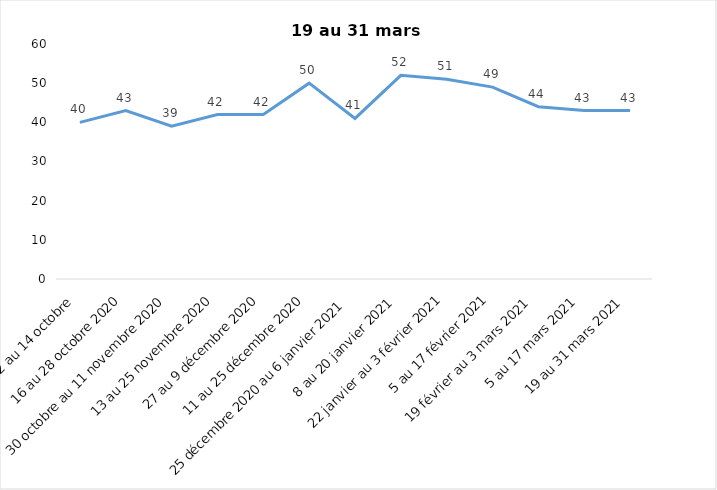
| Category | Toujours aux trois mesures |
|---|---|
| 2 au 14 octobre  | 40 |
| 16 au 28 octobre 2020 | 43 |
| 30 octobre au 11 novembre 2020 | 39 |
| 13 au 25 novembre 2020 | 42 |
| 27 au 9 décembre 2020 | 42 |
| 11 au 25 décembre 2020 | 50 |
| 25 décembre 2020 au 6 janvier 2021 | 41 |
| 8 au 20 janvier 2021 | 52 |
| 22 janvier au 3 février 2021 | 51 |
| 5 au 17 février 2021 | 49 |
| 19 février au 3 mars 2021 | 44 |
| 5 au 17 mars 2021 | 43 |
| 19 au 31 mars 2021 | 43 |